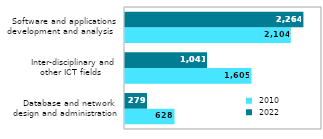
| Category |  2010 |  2022 |
|---|---|---|
|   Database and network
design and administration | 628 | 279 |
|   Inter-disciplinary and
other ICT fields | 1605 | 1041 |
|   Software and applications
development and analysis  | 2104 | 2264 |